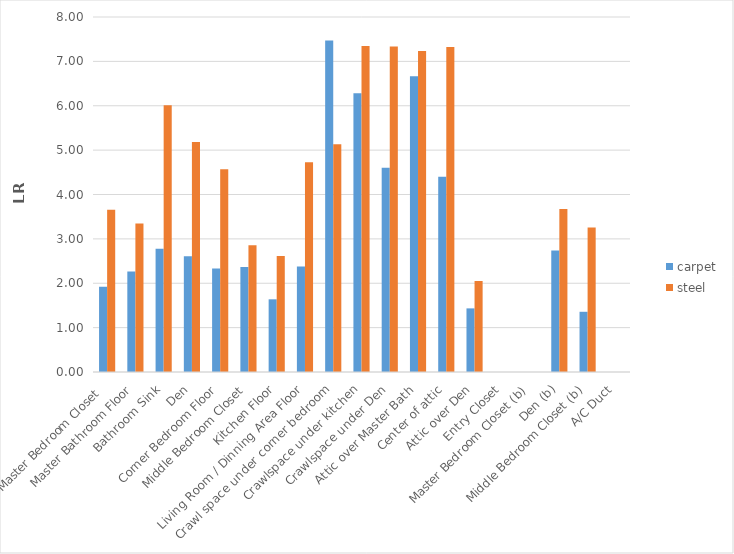
| Category | carpet | steel |
|---|---|---|
| Master Bedroom Closet  | 1.919 | 3.656 |
| Master Bathroom Floor | 2.267 | 3.347 |
| Bathroom Sink | 2.78 | 6.013 |
| Den | 2.606 | 5.183 |
| Corner Bedroom Floor | 2.332 | 4.571 |
| Middle Bedroom Closet | 2.367 | 2.858 |
| Kitchen Floor | 1.638 | 2.616 |
| Living Room / Dinning Area Floor | 2.376 | 4.727 |
| Crawl space under corner bedroom | 7.472 | 5.133 |
| Crawlspace under kitchen | 6.282 | 7.344 |
| Crawlspace under Den | 4.601 | 7.336 |
| Attic over Master Bath | 6.662 | 7.236 |
| Center of attic | 4.399 | 7.323 |
| Attic over Den | 1.434 | 2.053 |
| Entry Closet | 0 | 0 |
| Master Bedroom Closet (b) | 0 | 0 |
| Den (b) | 2.738 | 3.676 |
| Middle Bedroom Closet (b) | 1.357 | 3.259 |
| A/C Duct | 0 | 0 |